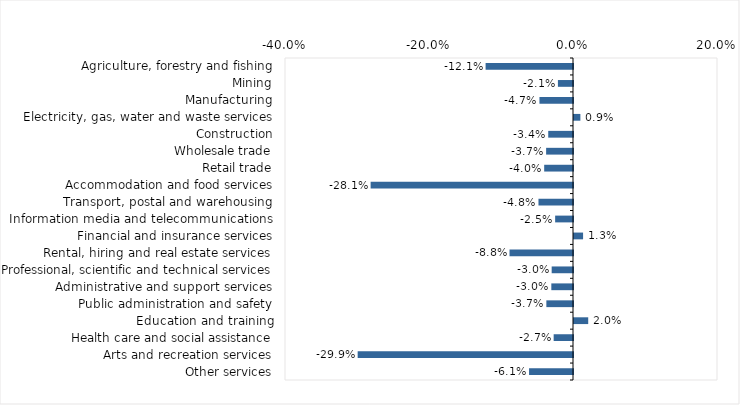
| Category | This week |
|---|---|
| Agriculture, forestry and fishing | -0.121 |
| Mining | -0.021 |
| Manufacturing | -0.047 |
| Electricity, gas, water and waste services | 0.009 |
| Construction | -0.034 |
| Wholesale trade | -0.037 |
| Retail trade | -0.04 |
| Accommodation and food services | -0.281 |
| Transport, postal and warehousing | -0.048 |
| Information media and telecommunications | -0.025 |
| Financial and insurance services | 0.013 |
| Rental, hiring and real estate services | -0.088 |
| Professional, scientific and technical services | -0.03 |
| Administrative and support services | -0.03 |
| Public administration and safety | -0.037 |
| Education and training | 0.02 |
| Health care and social assistance | -0.027 |
| Arts and recreation services | -0.299 |
| Other services | -0.061 |